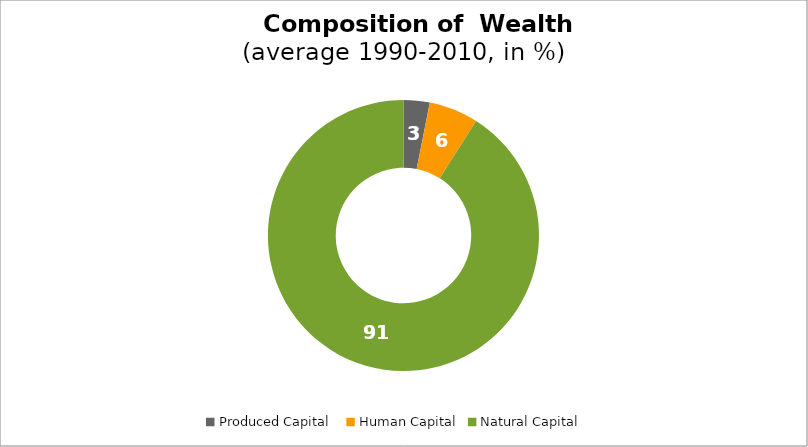
| Category | Series 0 |
|---|---|
| Produced Capital  | 3.113 |
| Human Capital | 5.891 |
| Natural Capital | 90.996 |